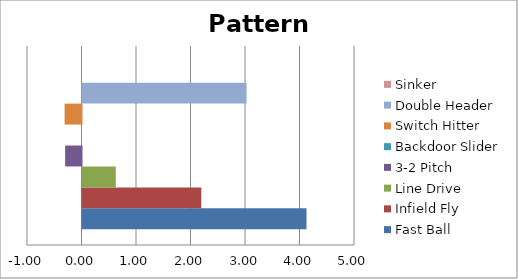
| Category | Fast Ball | Infield Fly | Line Drive | 3-2 Pitch | Backdoor Slider | Switch Hitter | Double Header | Sinker |
|---|---|---|---|---|---|---|---|---|
| 0 | 4.11 | 2.18 | 0.61 | -0.3 | 0 | -0.31 | 3.01 | 0 |